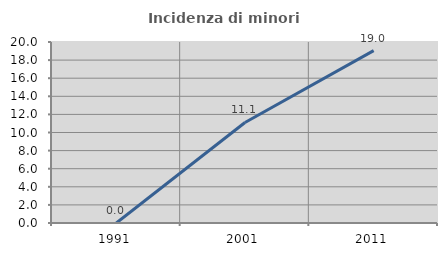
| Category | Incidenza di minori stranieri |
|---|---|
| 1991.0 | 0 |
| 2001.0 | 11.111 |
| 2011.0 | 19.048 |